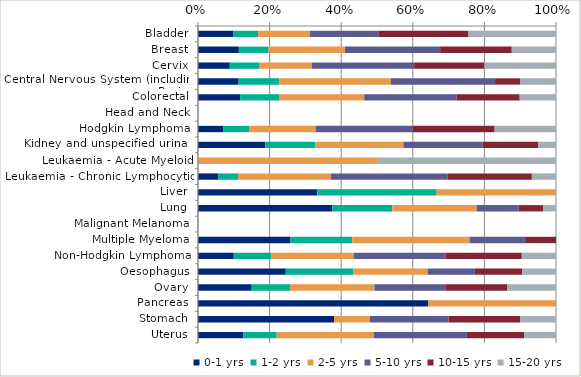
| Category | 0-1 yrs | 1-2 yrs | 2-5 yrs | 5-10 yrs | 10-15 yrs | 15-20 yrs |
|---|---|---|---|---|---|---|
| Bladder | 0.099 | 0.069 | 0.145 | 0.191 | 0.252 | 0.244 |
| Breast | 0.114 | 0.083 | 0.213 | 0.266 | 0.2 | 0.124 |
| Cervix | 0.089 | 0.081 | 0.148 | 0.285 | 0.196 | 0.2 |
| Central Nervous System (including Brain) | 0.113 | 0.113 | 0.312 | 0.291 | 0.071 | 0.099 |
| Colorectal | 0.118 | 0.109 | 0.238 | 0.258 | 0.176 | 0.101 |
| Head and Neck | 0 | 0 | 0 | 0 | 0 | 0 |
| Hodgkin Lymphoma | 0.071 | 0.071 | 0.186 | 0.271 | 0.229 | 0.171 |
| Kidney and unspecified urinary organs | 0.189 | 0.139 | 0.246 | 0.221 | 0.156 | 0.049 |
| Leukaemia - Acute Myeloid | 0 | 0 | 0.5 | 0 | 0 | 0.5 |
| Leukaemia - Chronic Lymphocytic | 0.056 | 0.056 | 0.258 | 0.326 | 0.236 | 0.067 |
| Liver | 0.333 | 0.333 | 0.333 | 0 | 0 | 0 |
| Lung | 0.376 | 0.167 | 0.235 | 0.118 | 0.068 | 0.036 |
| Malignant Melanoma | 0 | 0 | 0 | 0 | 0 | 0 |
| Multiple Myeloma | 0.259 | 0.172 | 0.328 | 0.155 | 0.086 | 0 |
| Non-Hodgkin Lymphoma | 0.1 | 0.104 | 0.23 | 0.257 | 0.213 | 0.096 |
| Oesophagus | 0.245 | 0.189 | 0.208 | 0.132 | 0.132 | 0.094 |
| Ovary | 0.15 | 0.107 | 0.236 | 0.2 | 0.171 | 0.136 |
| Pancreas | 0.643 | 0 | 0.357 | 0 | 0 | 0 |
| Stomach | 0.38 | 0 | 0.1 | 0.22 | 0.2 | 0.1 |
| Uterus | 0.127 | 0.093 | 0.272 | 0.259 | 0.16 | 0.089 |